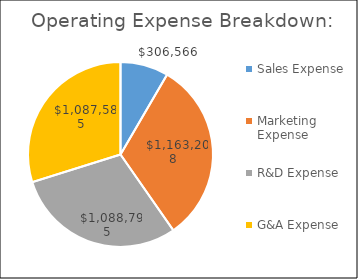
| Category | Series 1 |
|---|---|
| Sales Expense | 306565.625 |
| Marketing Expense | 1163208.325 |
| R&D Expense | 1088795.212 |
| G&A Expense | 1087584.95 |